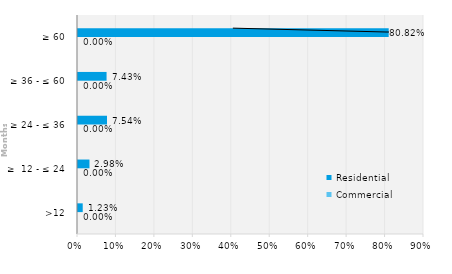
| Category | Commercial | Residential |
|---|---|---|
| >12 | 0 | 0.012 |
| ≥  12 - ≤ 24 | 0 | 0.03 |
| ≥ 24 - ≤ 36 | 0 | 0.075 |
| ≥ 36 - ≤ 60 | 0 | 0.074 |
| ≥ 60 | 0 | 0.808 |